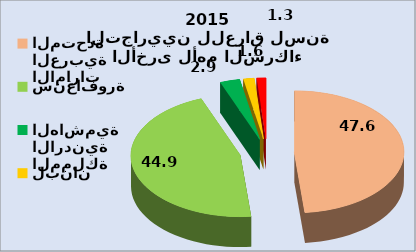
| Category | الصادرات السلعية الأخرى لأهم الشركاء التجاريين للعراق لسنة 2015 |
|---|---|
| الامارات العربية المتحدة | 47.567 |
| سنغافورة | 44.868 |
| المملكة الاردنية الهاشمية | 2.861 |
| لبنان | 1.553 |
| ايطاليا | 1.33 |